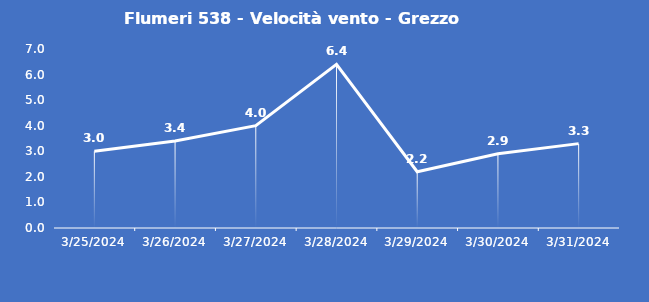
| Category | Flumeri 538 - Velocità vento - Grezzo (m/s) |
|---|---|
| 3/25/24 | 3 |
| 3/26/24 | 3.4 |
| 3/27/24 | 4 |
| 3/28/24 | 6.4 |
| 3/29/24 | 2.2 |
| 3/30/24 | 2.9 |
| 3/31/24 | 3.3 |